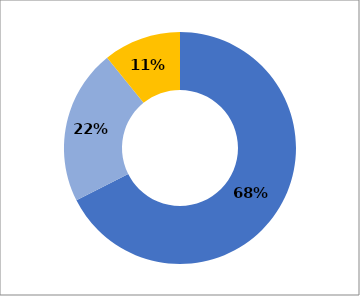
| Category | Series 0 |
|---|---|
| Promoción efectiva de la participación ciudadana  | 0.676 |
| Condiciones institucionales idóneas para la promoción de la participación  | 0.216 |
| Fomento de la cultura institucional de participación ciudadana | 0.108 |